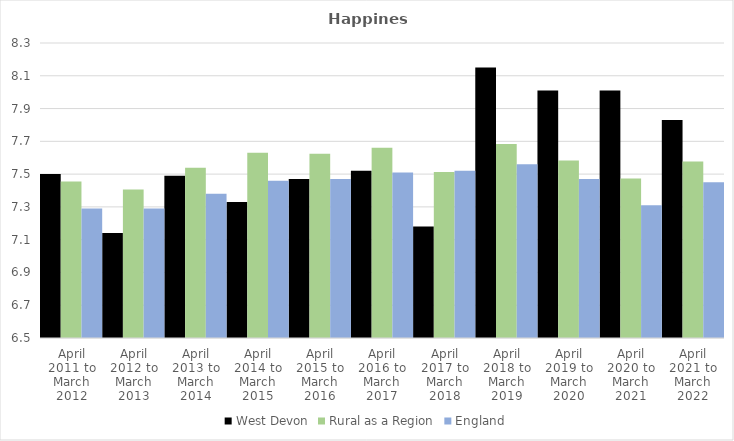
| Category | West Devon | Rural as a Region | England |
|---|---|---|---|
| April 2011 to March 2012 | 7.5 | 7.454 | 7.29 |
| April 2012 to March 2013 | 7.14 | 7.406 | 7.29 |
| April 2013 to March 2014 | 7.49 | 7.539 | 7.38 |
| April 2014 to March 2015 | 7.33 | 7.63 | 7.46 |
| April 2015 to March 2016 | 7.47 | 7.625 | 7.47 |
| April 2016 to March 2017 | 7.52 | 7.661 | 7.51 |
| April 2017 to March 2018 | 7.18 | 7.513 | 7.52 |
| April 2018 to March 2019 | 8.15 | 7.684 | 7.56 |
| April 2019 to March 2020 | 8.01 | 7.582 | 7.47 |
| April 2020 to March 2021 | 8.01 | 7.474 | 7.31 |
| April 2021 to March 2022 | 7.83 | 7.577 | 7.45 |